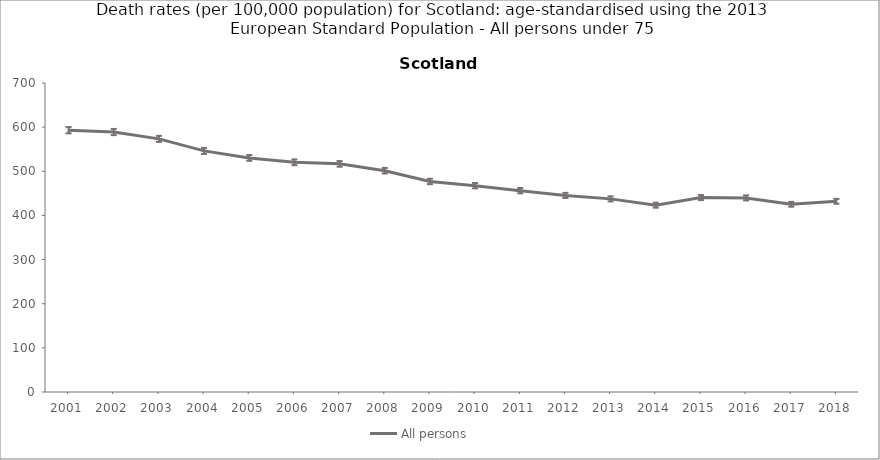
| Category | All persons |
|---|---|
| 2001.0 | 593.1 |
| 2002.0 | 588.9 |
| 2003.0 | 573.4 |
| 2004.0 | 546.2 |
| 2005.0 | 530.3 |
| 2006.0 | 520.4 |
| 2007.0 | 516.8 |
| 2008.0 | 501.3 |
| 2009.0 | 477 |
| 2010.0 | 467.4 |
| 2011.0 | 456.1 |
| 2012.0 | 445.3 |
| 2013.0 | 437.5 |
| 2014.0 | 423.2 |
| 2015.0 | 440.5 |
| 2016.0 | 439.7 |
| 2017.0 | 425.2 |
| 2018.0 | 432 |